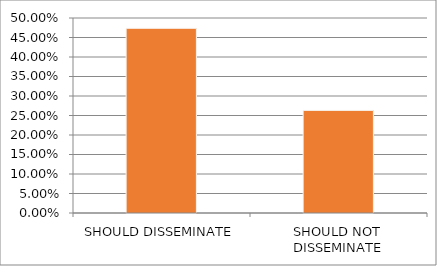
| Category | Series 0 |
|---|---|
| SHOULD DISSEMINATE | 0.474 |
| SHOULD NOT DISSEMINATE | 0.263 |